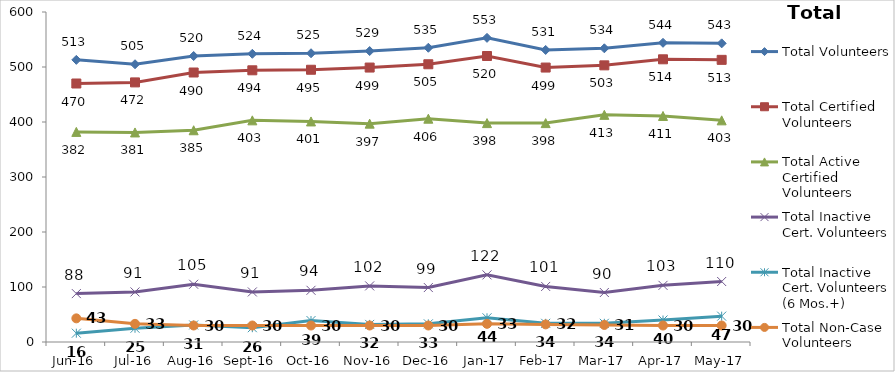
| Category | Total Volunteers | Total Certified Volunteers | Total Active Certified Volunteers | Total Inactive Cert. Volunteers | Total Inactive Cert. Volunteers (6 Mos.+) | Total Non-Case Volunteers |
|---|---|---|---|---|---|---|
| Jun-16 | 513 | 470 | 382 | 88 | 16 | 43 |
| Jul-16 | 505 | 472 | 381 | 91 | 25 | 33 |
| Aug-16 | 520 | 490 | 385 | 105 | 31 | 30 |
| Sep-16 | 524 | 494 | 403 | 91 | 26 | 30 |
| Oct-16 | 525 | 495 | 401 | 94 | 39 | 30 |
| Nov-16 | 529 | 499 | 397 | 102 | 32 | 30 |
| Dec-16 | 535 | 505 | 406 | 99 | 33 | 30 |
| Jan-17 | 553 | 520 | 398 | 122 | 44 | 33 |
| Feb-17 | 531 | 499 | 398 | 101 | 34 | 32 |
| Mar-17 | 534 | 503 | 413 | 90 | 34 | 31 |
| Apr-17 | 544 | 514 | 411 | 103 | 40 | 30 |
| May-17 | 543 | 513 | 403 | 110 | 47 | 30 |